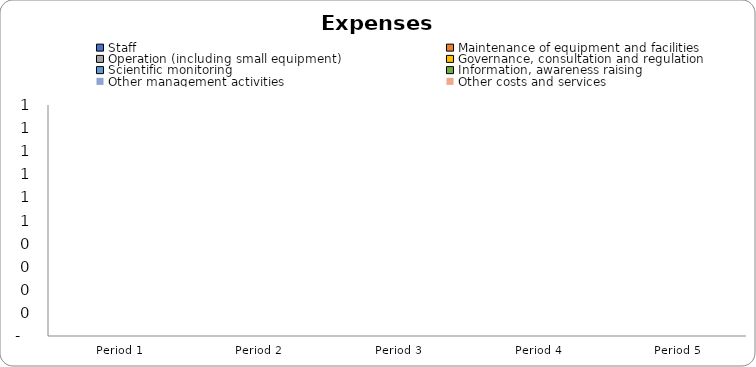
| Category | Staff | Maintenance of equipment and facilities | Operation (including small equipment) | Governance, consultation and regulation | Scientific monitoring | Information, awareness raising | Other management activities | Other costs and services |
|---|---|---|---|---|---|---|---|---|
|  Period 1 | 0 | 0 | 0 | 0 | 0 | 0 | 0 | 0 |
|  Period 2 | 0 | 0 | 0 | 0 | 0 | 0 | 0 | 0 |
|  Period 3 | 0 | 0 | 0 | 0 | 0 | 0 | 0 | 0 |
|  Period 4 | 0 | 0 | 0 | 0 | 0 | 0 | 0 | 0 |
|  Period 5 | 0 | 0 | 0 | 0 | 0 | 0 | 0 | 0 |